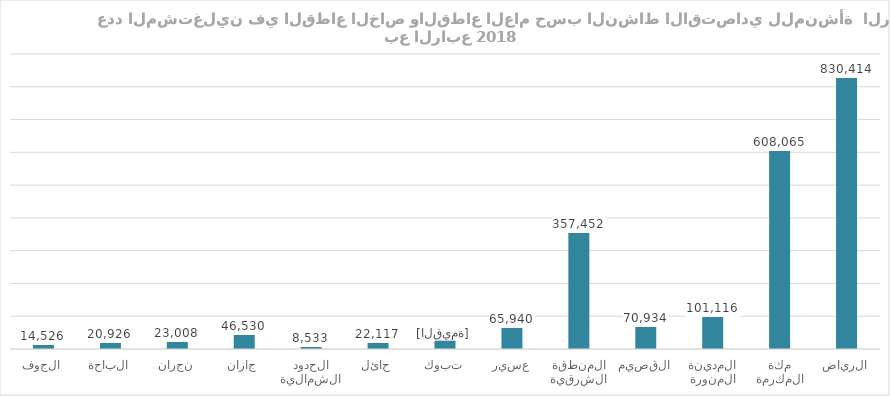
| Category | Series 0 |
|---|---|
| الرياض | 830414 |
| مكة المكرمة | 608065 |
| المدينة المنورة | 101116 |
| القصيم | 70934 |
| المنطقة الشرقية | 357452 |
| عسير | 65940 |
| تبوك | 25327 |
| حائل | 22117 |
| الحدود الشمالية | 8533 |
| جازان | 46530 |
| نجران | 23008 |
| الباحة | 20926 |
| الجوف | 14526 |